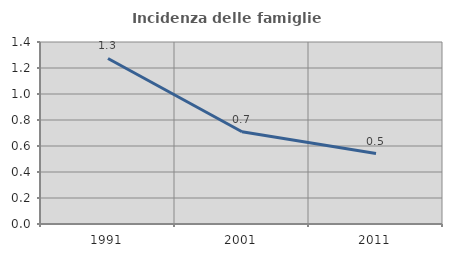
| Category | Incidenza delle famiglie numerose |
|---|---|
| 1991.0 | 1.273 |
| 2001.0 | 0.709 |
| 2011.0 | 0.542 |